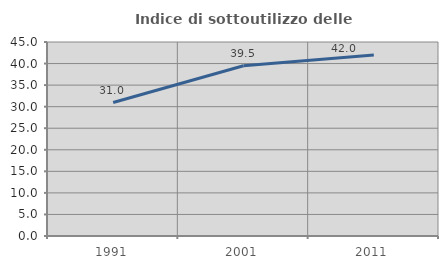
| Category | Indice di sottoutilizzo delle abitazioni  |
|---|---|
| 1991.0 | 30.954 |
| 2001.0 | 39.507 |
| 2011.0 | 41.957 |